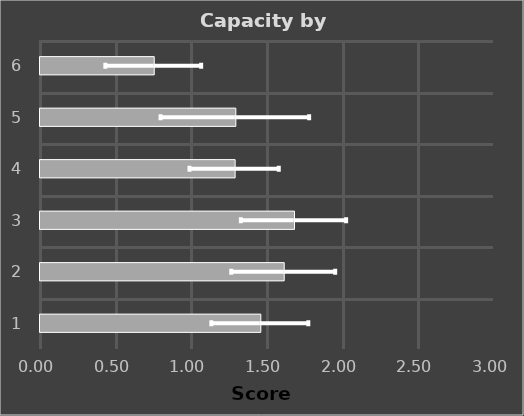
| Category | Series 0 |
|---|---|
| 1.0 | 1.459 |
| 2.0 | 1.614 |
| 3.0 | 1.682 |
| 4.0 | 1.289 |
| 5.0 | 1.294 |
| 6.0 | 0.755 |